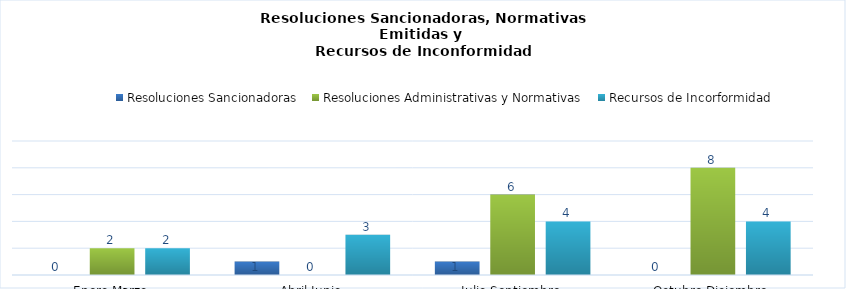
| Category | Resoluciones Sancionadoras | Resoluciones Administrativas y Normativas | Recursos de Incorformidad |
|---|---|---|---|
| Enero-Marzo | 0 | 2 | 2 |
| Abril-Junio | 1 | 0 | 3 |
| Julio-Septiembre | 1 | 6 | 4 |
| Octubre-Diciembre | 0 | 8 | 4 |